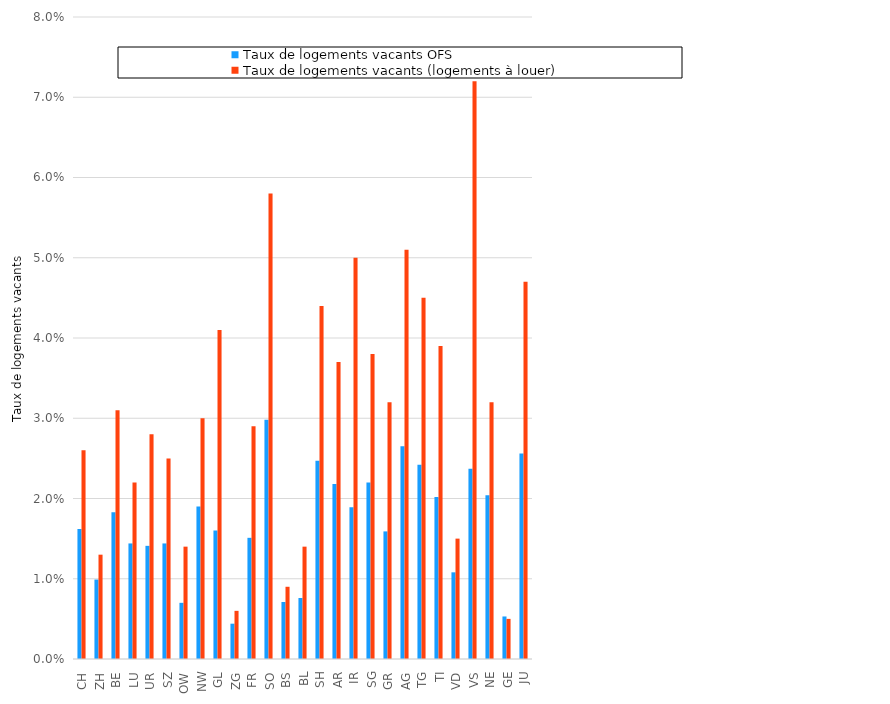
| Category | Taux de logements vacants OFS | Taux de logements vacants (logements à louer) |
|---|---|---|
| CH | 0.016 | 0.026 |
| ZH | 0.01 | 0.013 |
| BE | 0.018 | 0.031 |
| LU | 0.014 | 0.022 |
| UR | 0.014 | 0.028 |
| SZ | 0.014 | 0.025 |
| OW | 0.007 | 0.014 |
| NW | 0.019 | 0.03 |
| GL | 0.016 | 0.041 |
| ZG | 0.004 | 0.006 |
| FR | 0.015 | 0.029 |
| SO | 0.03 | 0.058 |
| BS | 0.007 | 0.009 |
| BL | 0.008 | 0.014 |
| SH | 0.025 | 0.044 |
| AR | 0.022 | 0.037 |
| IR | 0.019 | 0.05 |
| SG | 0.022 | 0.038 |
| GR | 0.016 | 0.032 |
| AG | 0.026 | 0.051 |
| TG | 0.024 | 0.045 |
| TI | 0.02 | 0.039 |
| VD | 0.011 | 0.015 |
| VS | 0.024 | 0.072 |
| NE | 0.02 | 0.032 |
| GE | 0.005 | 0.005 |
| JU | 0.026 | 0.047 |